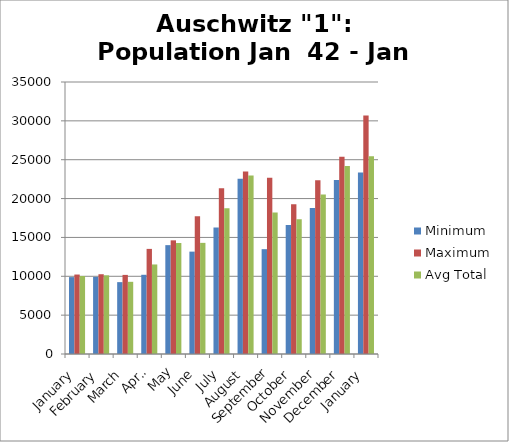
| Category | Minimum | Maximum | Avg Total |
|---|---|---|---|
| January | 9893 | 10225 | 10036.267 |
| February | 9923 | 10264 | 10122.524 |
| March | 9248 | 10179 | 9289.368 |
| April | 10193 | 13525 | 11520.842 |
| May | 14008 | 14624 | 14280.571 |
| June | 13173 | 17726 | 14300.389 |
| July | 16277 | 21327 | 18755.6 |
| August | 22549 | 23483 | 22965.158 |
| September | 13489 | 22666 | 18210.571 |
| October | 16592 | 19280 | 17335.231 |
| November | 18786 | 22373 | 20518.727 |
| December | 22391 | 25374 | 24205.12 |
| January | 23352 | 30704 | 25448.957 |